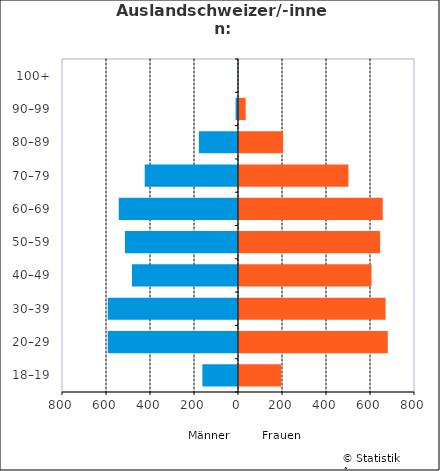
| Category | Männer | Frauen |
|---|---|---|
| 18–19 | -162 | 197 |
| 20–29 | -592 | 681 |
| 30–39 | -592 | 671 |
| 40–49 | -482 | 607 |
| 50–59 | -514 | 646 |
| 60–69 | -542 | 658 |
| 70–79 | -424 | 502 |
| 80–89 | -178 | 205 |
| 90–99 | -11 | 35 |
| 100+ | -1 | 0 |